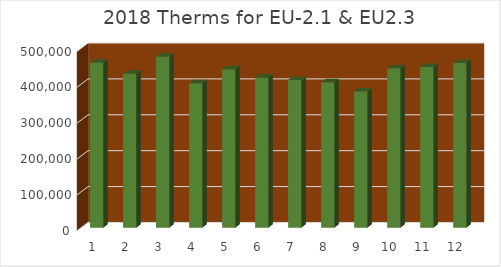
| Category | Series 0 |
|---|---|
| 0 | 460177.995 |
| 1 | 429413.889 |
| 2 | 477085.628 |
| 3 | 402616.291 |
| 4 | 441671.134 |
| 5 | 418829.522 |
| 6 | 411822.376 |
| 7 | 405446.505 |
| 8 | 380111.359 |
| 9 | 444101.54 |
| 10 | 448204.824 |
| 11 | 459367.86 |